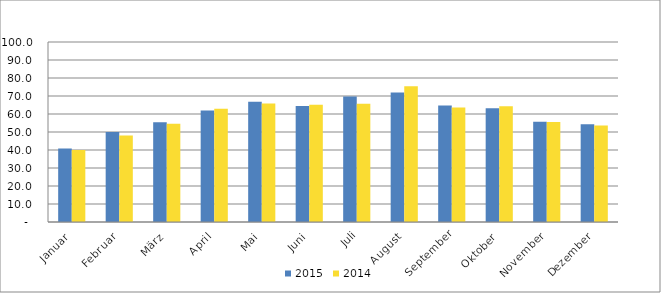
| Category | 2015 | 2014 |
|---|---|---|
| Januar | 40.805 | 39.932 |
| Februar | 50.024 | 48.076 |
| März | 55.349 | 54.552 |
| April | 61.944 | 62.934 |
| Mai | 66.76 | 65.83 |
| Juni | 64.386 | 65.093 |
| Juli | 69.731 | 65.749 |
| August | 71.964 | 75.423 |
| September | 64.776 | 63.618 |
| Oktober | 63.221 | 64.281 |
| November | 55.632 | 55.494 |
| Dezember | 54.276 | 53.605 |